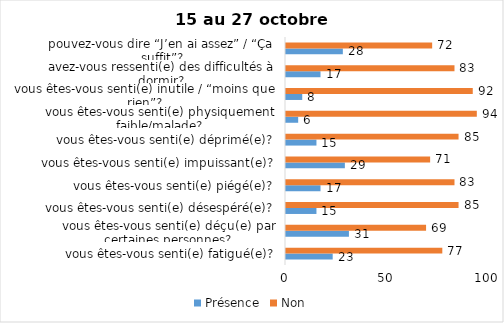
| Category | Présence | Non |
|---|---|---|
| vous êtes-vous senti(e) fatigué(e)? | 23 | 77 |
| vous êtes-vous senti(e) déçu(e) par certaines personnes? | 31 | 69 |
| vous êtes-vous senti(e) désespéré(e)? | 15 | 85 |
| vous êtes-vous senti(e) piégé(e)? | 17 | 83 |
| vous êtes-vous senti(e) impuissant(e)? | 29 | 71 |
| vous êtes-vous senti(e) déprimé(e)? | 15 | 85 |
| vous êtes-vous senti(e) physiquement faible/malade? | 6 | 94 |
| vous êtes-vous senti(e) inutile / “moins que rien”? | 8 | 92 |
| avez-vous ressenti(e) des difficultés à dormir? | 17 | 83 |
| pouvez-vous dire “J’en ai assez” / “Ça suffit”? | 28 | 72 |